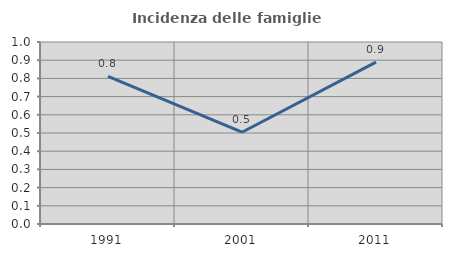
| Category | Incidenza delle famiglie numerose |
|---|---|
| 1991.0 | 0.812 |
| 2001.0 | 0.504 |
| 2011.0 | 0.89 |